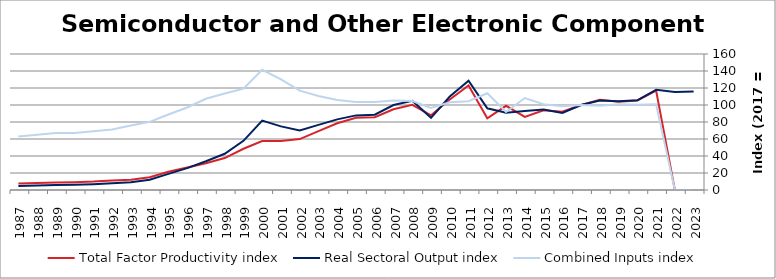
| Category | Total Factor Productivity index | Real Sectoral Output index | Combined Inputs index |
|---|---|---|---|
| 2023.0 | 0 | 115.994 | 0 |
| 2022.0 | 0 | 115.387 | 0 |
| 2021.0 | 116.932 | 117.859 | 100.792 |
| 2020.0 | 105.35 | 105.529 | 100.17 |
| 2019.0 | 103.75 | 104.526 | 100.749 |
| 2018.0 | 106.186 | 105.389 | 99.249 |
| 2017.0 | 100 | 100 | 100 |
| 2016.0 | 92.156 | 90.705 | 98.426 |
| 2015.0 | 93.775 | 94.608 | 100.889 |
| 2014.0 | 86.005 | 93.073 | 108.219 |
| 2013.0 | 99.067 | 90.865 | 91.721 |
| 2012.0 | 84.424 | 96.112 | 113.844 |
| 2011.0 | 123.026 | 128.587 | 104.52 |
| 2010.0 | 106.457 | 109.905 | 103.238 |
| 2009.0 | 87.804 | 84.865 | 96.653 |
| 2008.0 | 100.24 | 104.897 | 104.646 |
| 2007.0 | 94.986 | 99.928 | 105.202 |
| 2006.0 | 85.7 | 88.61 | 103.396 |
| 2005.0 | 84.875 | 87.79 | 103.435 |
| 2004.0 | 78.545 | 83.093 | 105.79 |
| 2003.0 | 69.324 | 76.615 | 110.517 |
| 2002.0 | 59.895 | 70.022 | 116.907 |
| 2001.0 | 57.565 | 74.876 | 130.071 |
| 2000.0 | 57.68 | 81.582 | 141.438 |
| 1999.0 | 48.509 | 57.869 | 119.296 |
| 1998.0 | 37.59 | 42.636 | 113.424 |
| 1997.0 | 31.483 | 33.773 | 107.275 |
| 1996.0 | 26.552 | 25.785 | 97.109 |
| 1995.0 | 21.381 | 18.982 | 88.779 |
| 1994.0 | 15.074 | 12.091 | 80.211 |
| 1993.0 | 12.144 | 9.22 | 75.922 |
| 1992.0 | 11.172 | 7.967 | 71.31 |
| 1991.0 | 9.86 | 6.825 | 69.225 |
| 1990.0 | 9.184 | 6.165 | 67.12 |
| 1989.0 | 8.694 | 5.824 | 66.993 |
| 1988.0 | 8.286 | 5.388 | 65.023 |
| 1987.0 | 7.621 | 4.796 | 62.927 |